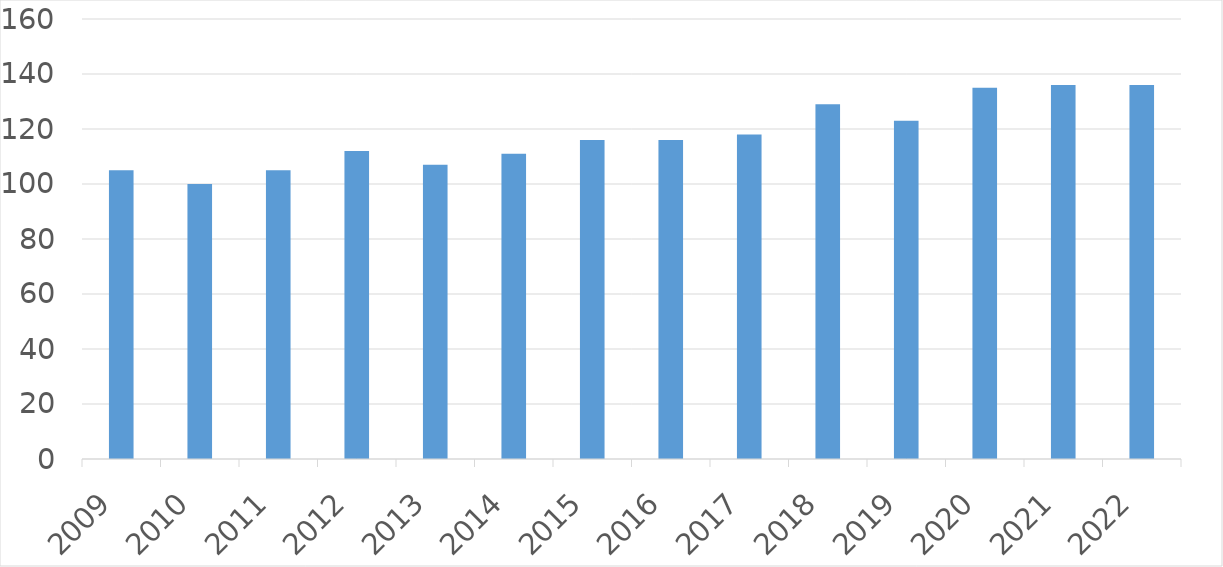
| Category | Series 0 |
|---|---|
| 2009 | 105 |
| 2010 | 100 |
| 2011 | 105 |
| 2012 | 112 |
| 2013 | 107 |
| 2014 | 111 |
| 2015 | 116 |
| 2016 | 116 |
| 2017 | 118 |
| 2018 | 129 |
| 2019 | 123 |
| 2020 | 135 |
| 2021 | 136 |
| 2022 | 136 |